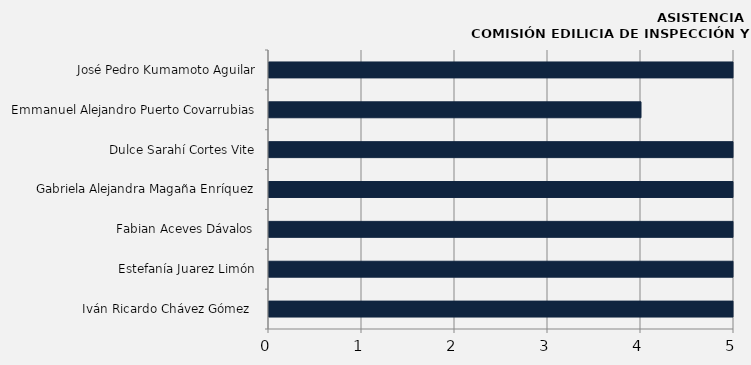
| Category | Iván Ricardo Chávez Gómez  |
|---|---|
| Iván Ricardo Chávez Gómez  | 8 |
| Estefanía Juarez Limón | 8 |
| Fabian Aceves Dávalos | 8 |
| Gabriela Alejandra Magaña Enríquez | 8 |
| Dulce Sarahí Cortes Vite | 8 |
| Emmanuel Alejandro Puerto Covarrubias | 4 |
| José Pedro Kumamoto Aguilar | 7 |